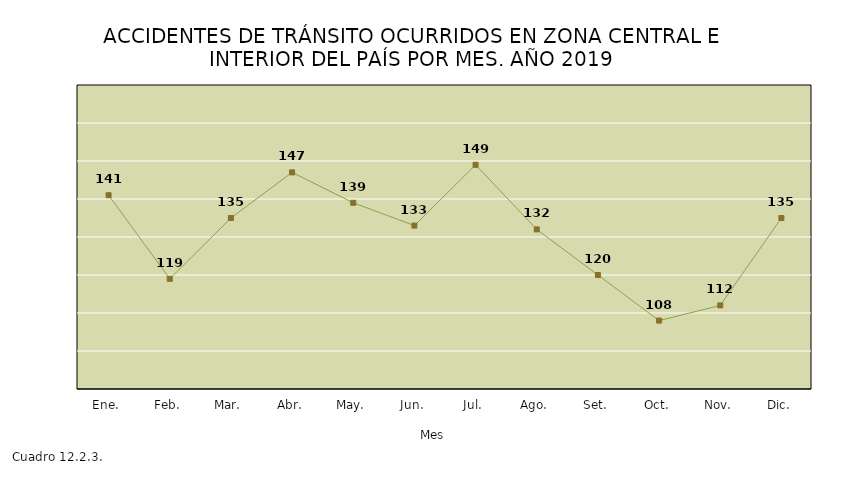
| Category | Series 0 |
|---|---|
| Ene. | 141 |
| Feb. | 119 |
| Mar. | 135 |
| Abr. | 147 |
| May. | 139 |
| Jun. | 133 |
| Jul. | 149 |
| Ago. | 132 |
| Set. | 120 |
| Oct. | 108 |
| Nov. | 112 |
| Dic. | 135 |